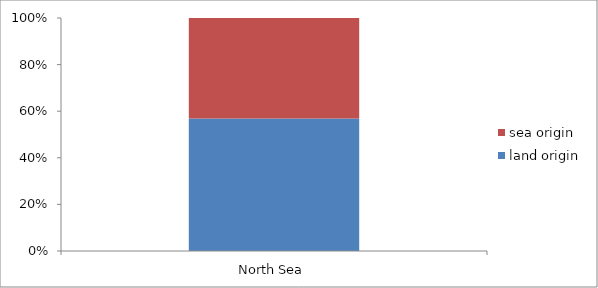
| Category | land origin | sea origin |
|---|---|---|
| North Sea | 285109 | 216327.25 |